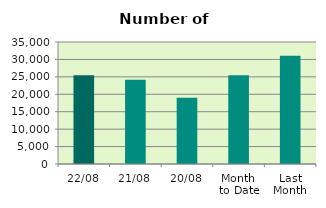
| Category | Series 0 |
|---|---|
| 22/08 | 25480 |
| 21/08 | 24140 |
| 20/08 | 19012 |
| Month 
to Date | 25484.125 |
| Last
Month | 31061.545 |